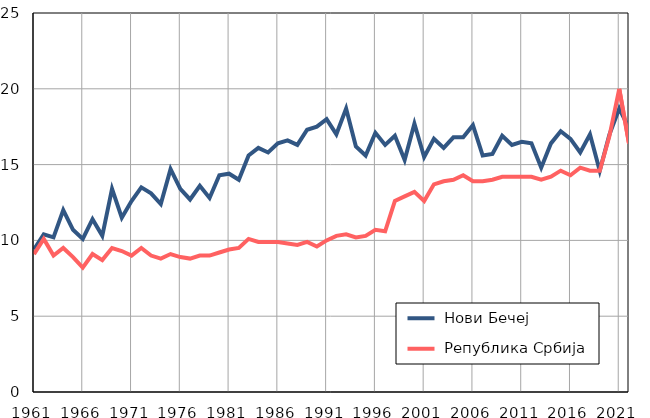
| Category |  Нови Бечеј |  Република Србија |
|---|---|---|
| 1961.0 | 9.4 | 9.1 |
| 1962.0 | 10.4 | 10.1 |
| 1963.0 | 10.2 | 9 |
| 1964.0 | 12 | 9.5 |
| 1965.0 | 10.7 | 8.9 |
| 1966.0 | 10.1 | 8.2 |
| 1967.0 | 11.4 | 9.1 |
| 1968.0 | 10.3 | 8.7 |
| 1969.0 | 13.4 | 9.5 |
| 1970.0 | 11.5 | 9.3 |
| 1971.0 | 12.6 | 9 |
| 1972.0 | 13.5 | 9.5 |
| 1973.0 | 13.1 | 9 |
| 1974.0 | 12.4 | 8.8 |
| 1975.0 | 14.7 | 9.1 |
| 1976.0 | 13.4 | 8.9 |
| 1977.0 | 12.7 | 8.8 |
| 1978.0 | 13.6 | 9 |
| 1979.0 | 12.8 | 9 |
| 1980.0 | 14.3 | 9.2 |
| 1981.0 | 14.4 | 9.4 |
| 1982.0 | 14 | 9.5 |
| 1983.0 | 15.6 | 10.1 |
| 1984.0 | 16.1 | 9.9 |
| 1985.0 | 15.8 | 9.9 |
| 1986.0 | 16.4 | 9.9 |
| 1987.0 | 16.6 | 9.8 |
| 1988.0 | 16.3 | 9.7 |
| 1989.0 | 17.3 | 9.9 |
| 1990.0 | 17.5 | 9.6 |
| 1991.0 | 18 | 10 |
| 1992.0 | 17 | 10.3 |
| 1993.0 | 18.7 | 10.4 |
| 1994.0 | 16.2 | 10.2 |
| 1995.0 | 15.6 | 10.3 |
| 1996.0 | 17.1 | 10.7 |
| 1997.0 | 16.3 | 10.6 |
| 1998.0 | 16.9 | 12.6 |
| 1999.0 | 15.3 | 12.9 |
| 2000.0 | 17.7 | 13.2 |
| 2001.0 | 15.5 | 12.6 |
| 2002.0 | 16.7 | 13.7 |
| 2003.0 | 16.1 | 13.9 |
| 2004.0 | 16.8 | 14 |
| 2005.0 | 16.8 | 14.3 |
| 2006.0 | 17.6 | 13.9 |
| 2007.0 | 15.6 | 13.9 |
| 2008.0 | 15.7 | 14 |
| 2009.0 | 16.9 | 14.2 |
| 2010.0 | 16.3 | 14.2 |
| 2011.0 | 16.5 | 14.2 |
| 2012.0 | 16.4 | 14.2 |
| 2013.0 | 14.8 | 14 |
| 2014.0 | 16.4 | 14.2 |
| 2015.0 | 17.2 | 14.6 |
| 2016.0 | 16.7 | 14.3 |
| 2017.0 | 15.8 | 14.8 |
| 2018.0 | 17 | 14.6 |
| 2019.0 | 14.6 | 14.6 |
| 2020.0 | 17 | 16.9 |
| 2021.0 | 18.7 | 20 |
| 2022.0 | 17.4 | 16.4 |